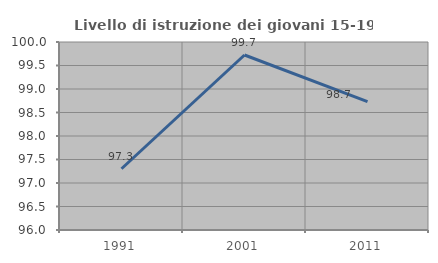
| Category | Livello di istruzione dei giovani 15-19 anni |
|---|---|
| 1991.0 | 97.303 |
| 2001.0 | 99.723 |
| 2011.0 | 98.731 |